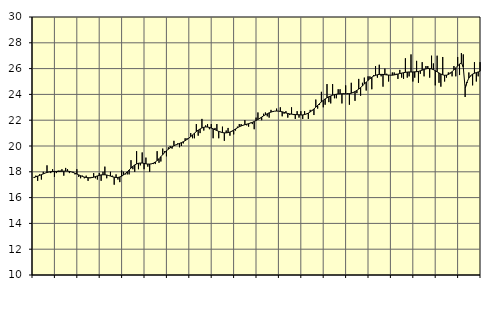
| Category | Finansiell verksamhet, företagstjänster, SNI 64-82 | Series 1 |
|---|---|---|
| nan | 17.6 | 17.55 |
| 1.0 | 17.7 | 17.61 |
| 1.0 | 17.3 | 17.66 |
| 1.0 | 17.8 | 17.72 |
| 1.0 | 17.4 | 17.78 |
| 1.0 | 18 | 17.84 |
| 1.0 | 17.9 | 17.9 |
| 1.0 | 18.5 | 17.95 |
| 1.0 | 18 | 17.98 |
| 1.0 | 17.9 | 18.01 |
| 1.0 | 18.2 | 18.02 |
| 1.0 | 17.6 | 18.03 |
| nan | 17.9 | 18.03 |
| 2.0 | 18.1 | 18.02 |
| 2.0 | 18.1 | 18.03 |
| 2.0 | 18.2 | 18.04 |
| 2.0 | 17.7 | 18.05 |
| 2.0 | 18.3 | 18.05 |
| 2.0 | 18.2 | 18.05 |
| 2.0 | 17.9 | 18.03 |
| 2.0 | 18 | 18 |
| 2.0 | 18 | 17.95 |
| 2.0 | 17.8 | 17.89 |
| 2.0 | 18.2 | 17.83 |
| nan | 17.6 | 17.76 |
| 3.0 | 17.5 | 17.7 |
| 3.0 | 17.7 | 17.64 |
| 3.0 | 17.5 | 17.59 |
| 3.0 | 17.7 | 17.56 |
| 3.0 | 17.3 | 17.54 |
| 3.0 | 17.5 | 17.54 |
| 3.0 | 17.6 | 17.55 |
| 3.0 | 17.9 | 17.58 |
| 3.0 | 17.5 | 17.63 |
| 3.0 | 17.4 | 17.68 |
| 3.0 | 17.9 | 17.72 |
| nan | 17.3 | 17.76 |
| 4.0 | 18 | 17.77 |
| 4.0 | 18.4 | 17.77 |
| 4.0 | 17.5 | 17.75 |
| 4.0 | 17.7 | 17.71 |
| 4.0 | 18 | 17.67 |
| 4.0 | 17.7 | 17.62 |
| 4.0 | 17 | 17.58 |
| 4.0 | 17.8 | 17.56 |
| 4.0 | 17.4 | 17.56 |
| 4.0 | 17.2 | 17.6 |
| 4.0 | 18.1 | 17.66 |
| nan | 18 | 17.76 |
| 5.0 | 17.8 | 17.87 |
| 5.0 | 17.8 | 18 |
| 5.0 | 17.8 | 18.14 |
| 5.0 | 18.9 | 18.29 |
| 5.0 | 18.2 | 18.42 |
| 5.0 | 18 | 18.53 |
| 5.0 | 19.6 | 18.61 |
| 5.0 | 18.2 | 18.66 |
| 5.0 | 18.5 | 18.68 |
| 5.0 | 19.5 | 18.68 |
| 5.0 | 18.2 | 18.65 |
| nan | 19.1 | 18.62 |
| 6.0 | 18.4 | 18.6 |
| 6.0 | 18 | 18.6 |
| 6.0 | 18.6 | 18.62 |
| 6.0 | 18.6 | 18.67 |
| 6.0 | 18.6 | 18.76 |
| 6.0 | 19.6 | 18.87 |
| 6.0 | 18.7 | 19.01 |
| 6.0 | 18.8 | 19.17 |
| 6.0 | 19.8 | 19.33 |
| 6.0 | 19.6 | 19.49 |
| 6.0 | 19.2 | 19.63 |
| nan | 19.9 | 19.75 |
| 7.0 | 20 | 19.86 |
| 7.0 | 19.8 | 19.94 |
| 7.0 | 20.4 | 20.02 |
| 7.0 | 20.1 | 20.08 |
| 7.0 | 20.2 | 20.14 |
| 7.0 | 19.9 | 20.2 |
| 7.0 | 20 | 20.26 |
| 7.0 | 20.2 | 20.33 |
| 7.0 | 20.6 | 20.41 |
| 7.0 | 20.6 | 20.51 |
| 7.0 | 20.6 | 20.61 |
| nan | 21 | 20.73 |
| 8.0 | 20.6 | 20.86 |
| 8.0 | 20.6 | 20.99 |
| 8.0 | 21.7 | 21.12 |
| 8.0 | 20.8 | 21.23 |
| 8.0 | 21 | 21.32 |
| 8.0 | 22.1 | 21.4 |
| 8.0 | 21.2 | 21.45 |
| 8.0 | 21.6 | 21.48 |
| 8.0 | 21.7 | 21.47 |
| 8.0 | 21.3 | 21.44 |
| 8.0 | 21.7 | 21.39 |
| nan | 20.6 | 21.33 |
| 9.0 | 21.4 | 21.26 |
| 9.0 | 21.7 | 21.2 |
| 9.0 | 20.6 | 21.13 |
| 9.0 | 21.1 | 21.08 |
| 9.0 | 21.5 | 21.04 |
| 9.0 | 20.4 | 21.02 |
| 9.0 | 21.2 | 21.02 |
| 9.0 | 21.4 | 21.04 |
| 9.0 | 20.8 | 21.08 |
| 9.0 | 21.1 | 21.15 |
| 9.0 | 20.9 | 21.23 |
| nan | 21.2 | 21.32 |
| 10.0 | 21.5 | 21.41 |
| 10.0 | 21.7 | 21.49 |
| 10.0 | 21.7 | 21.55 |
| 10.0 | 21.6 | 21.61 |
| 10.0 | 22 | 21.65 |
| 10.0 | 21.6 | 21.69 |
| 10.0 | 21.5 | 21.73 |
| 10.0 | 21.8 | 21.78 |
| 10.0 | 21.7 | 21.83 |
| 10.0 | 21.3 | 21.9 |
| 10.0 | 22.2 | 21.98 |
| nan | 22.6 | 22.06 |
| 11.0 | 22.1 | 22.15 |
| 11.0 | 22 | 22.24 |
| 11.0 | 22.5 | 22.34 |
| 11.0 | 22.6 | 22.42 |
| 11.0 | 22.3 | 22.5 |
| 11.0 | 22.2 | 22.57 |
| 11.0 | 22.8 | 22.63 |
| 11.0 | 22.7 | 22.67 |
| 11.0 | 22.7 | 22.7 |
| 11.0 | 22.9 | 22.71 |
| 11.0 | 22.7 | 22.7 |
| nan | 23 | 22.68 |
| 12.0 | 22.3 | 22.65 |
| 12.0 | 22.5 | 22.61 |
| 12.0 | 22.7 | 22.56 |
| 12.0 | 22.2 | 22.52 |
| 12.0 | 22.4 | 22.49 |
| 12.0 | 23 | 22.47 |
| 12.0 | 22.4 | 22.45 |
| 12.0 | 22.1 | 22.44 |
| 12.0 | 22.7 | 22.43 |
| 12.0 | 22.2 | 22.42 |
| 12.0 | 22.7 | 22.41 |
| nan | 22.1 | 22.41 |
| 13.0 | 22.7 | 22.44 |
| 13.0 | 22.5 | 22.48 |
| 13.0 | 22.1 | 22.55 |
| 13.0 | 22.8 | 22.64 |
| 13.0 | 22.8 | 22.75 |
| 13.0 | 22.4 | 22.87 |
| 13.0 | 23.6 | 23.01 |
| 13.0 | 22.9 | 23.15 |
| 13.0 | 23.2 | 23.29 |
| 13.0 | 24.2 | 23.42 |
| 13.0 | 23 | 23.54 |
| nan | 23.2 | 23.65 |
| 14.0 | 24.8 | 23.74 |
| 14.0 | 23.4 | 23.82 |
| 14.0 | 23.3 | 23.88 |
| 14.0 | 24.8 | 23.94 |
| 14.0 | 23.7 | 23.98 |
| 14.0 | 23.7 | 24.01 |
| 14.0 | 24.4 | 24.04 |
| 14.0 | 24.4 | 24.05 |
| 14.0 | 23.3 | 24.05 |
| 14.0 | 24.1 | 24.05 |
| 14.0 | 24.7 | 24.04 |
| nan | 24.1 | 24.05 |
| 15.0 | 23.2 | 24.06 |
| 15.0 | 24.9 | 24.09 |
| 15.0 | 24.1 | 24.15 |
| 15.0 | 23.5 | 24.22 |
| 15.0 | 24.1 | 24.31 |
| 15.0 | 25.2 | 24.41 |
| 15.0 | 23.9 | 24.53 |
| 15.0 | 24.9 | 24.66 |
| 15.0 | 25.3 | 24.8 |
| 15.0 | 24.3 | 24.95 |
| 15.0 | 25.4 | 25.09 |
| nan | 25.4 | 25.22 |
| 16.0 | 24.4 | 25.33 |
| 16.0 | 25.5 | 25.42 |
| 16.0 | 26.2 | 25.48 |
| 16.0 | 25.3 | 25.52 |
| 16.0 | 26.3 | 25.55 |
| 16.0 | 25.4 | 25.55 |
| 16.0 | 24.6 | 25.55 |
| 16.0 | 26 | 25.53 |
| 16.0 | 25.6 | 25.51 |
| 16.0 | 25 | 25.5 |
| 16.0 | 25.5 | 25.49 |
| nan | 25.7 | 25.49 |
| 17.0 | 25.7 | 25.51 |
| 17.0 | 25.6 | 25.54 |
| 17.0 | 25.2 | 25.58 |
| 17.0 | 25.9 | 25.62 |
| 17.0 | 25.3 | 25.65 |
| 17.0 | 25.2 | 25.68 |
| 17.0 | 26.8 | 25.71 |
| 17.0 | 25.3 | 25.73 |
| 17.0 | 25.4 | 25.74 |
| 17.0 | 27.1 | 25.74 |
| 17.0 | 25 | 25.74 |
| nan | 25.3 | 25.75 |
| 18.0 | 26.6 | 25.76 |
| 18.0 | 24.9 | 25.78 |
| 18.0 | 25.6 | 25.83 |
| 18.0 | 26.5 | 25.88 |
| 18.0 | 25.4 | 25.93 |
| 18.0 | 26.2 | 25.98 |
| 18.0 | 26.2 | 26.01 |
| 18.0 | 25.3 | 26 |
| 18.0 | 27 | 25.98 |
| 18.0 | 26.4 | 25.92 |
| 18.0 | 24.7 | 25.84 |
| nan | 27 | 25.75 |
| 19.0 | 24.9 | 25.66 |
| 19.0 | 24.6 | 25.58 |
| 19.0 | 26.9 | 25.52 |
| 19.0 | 25 | 25.48 |
| 19.0 | 25.3 | 25.49 |
| 19.0 | 25.7 | 25.54 |
| 19.0 | 25.7 | 25.63 |
| 19.0 | 25.4 | 25.76 |
| 19.0 | 26.2 | 25.9 |
| 19.0 | 25.4 | 26.06 |
| 19.0 | 26.9 | 26.21 |
| nan | 25.5 | 26.35 |
| 20.0 | 27.2 | 26.45 |
| 20.0 | 27.1 | 26.1 |
| 20.0 | 23.8 | 24.48 |
| 20.0 | 24.9 | 24.96 |
| 20.0 | 25.7 | 25.27 |
| 20.0 | 25.4 | 25.46 |
| 20.0 | 24.7 | 25.57 |
| 20.0 | 26.5 | 25.64 |
| 20.0 | 25 | 25.69 |
| 20.0 | 25.4 | 25.74 |
| 20.0 | 26.5 | 25.8 |